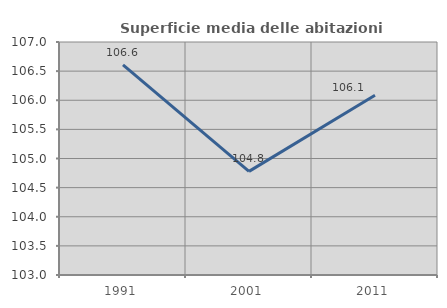
| Category | Superficie media delle abitazioni occupate |
|---|---|
| 1991.0 | 106.607 |
| 2001.0 | 104.778 |
| 2011.0 | 106.085 |